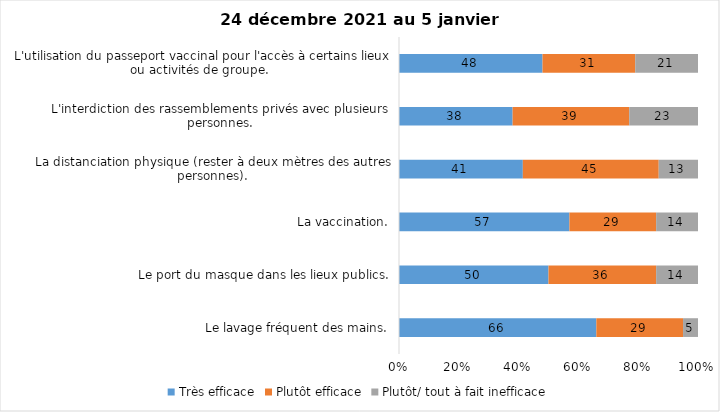
| Category | Très efficace | Plutôt efficace | Plutôt/ tout à fait inefficace |
|---|---|---|---|
| Le lavage fréquent des mains. | 66 | 29 | 5 |
| Le port du masque dans les lieux publics. | 50 | 36 | 14 |
| La vaccination. | 57 | 29 | 14 |
| La distanciation physique (rester à deux mètres des autres personnes). | 41 | 45 | 13 |
| L'interdiction des rassemblements privés avec plusieurs personnes. | 38 | 39 | 23 |
| L'utilisation du passeport vaccinal pour l'accès à certains lieux ou activités de groupe.  | 48 | 31 | 21 |